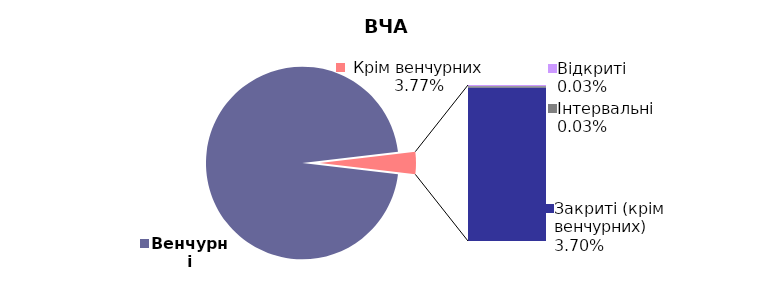
| Category | 30.06.2017 |
|---|---|
| Венчурні | 0.962 |
| Відкриті | 0 |
| Інтервальні | 0 |
| Закриті (крім венчурних) | 0.037 |